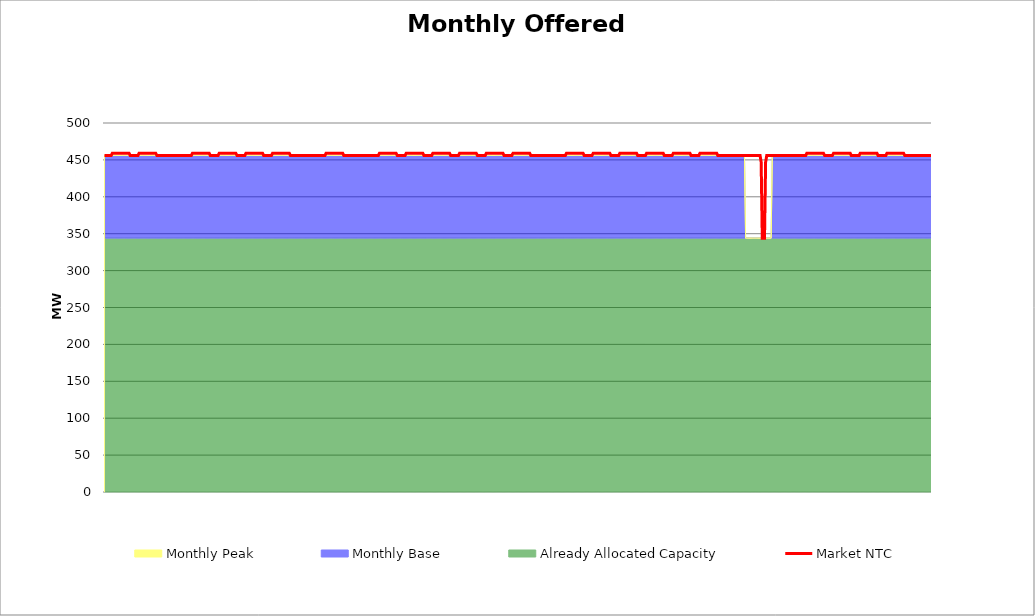
| Category | Market NTC |
|---|---|
| 0 | 456 |
| 1 | 456 |
| 2 | 456 |
| 3 | 456 |
| 4 | 456 |
| 5 | 456 |
| 6 | 456 |
| 7 | 459 |
| 8 | 459 |
| 9 | 459 |
| 10 | 459 |
| 11 | 459 |
| 12 | 459 |
| 13 | 459 |
| 14 | 459 |
| 15 | 459 |
| 16 | 459 |
| 17 | 459 |
| 18 | 459 |
| 19 | 459 |
| 20 | 459 |
| 21 | 459 |
| 22 | 459 |
| 23 | 456 |
| 24 | 456 |
| 25 | 456 |
| 26 | 456 |
| 27 | 456 |
| 28 | 456 |
| 29 | 456 |
| 30 | 456 |
| 31 | 459 |
| 32 | 459 |
| 33 | 459 |
| 34 | 459 |
| 35 | 459 |
| 36 | 459 |
| 37 | 459 |
| 38 | 459 |
| 39 | 459 |
| 40 | 459 |
| 41 | 459 |
| 42 | 459 |
| 43 | 459 |
| 44 | 459 |
| 45 | 459 |
| 46 | 459 |
| 47 | 456 |
| 48 | 456 |
| 49 | 456 |
| 50 | 456 |
| 51 | 456 |
| 52 | 456 |
| 53 | 456 |
| 54 | 456 |
| 55 | 456 |
| 56 | 456 |
| 57 | 456 |
| 58 | 456 |
| 59 | 456 |
| 60 | 456 |
| 61 | 456 |
| 62 | 456 |
| 63 | 456 |
| 64 | 456 |
| 65 | 456 |
| 66 | 456 |
| 67 | 456 |
| 68 | 456 |
| 69 | 456 |
| 70 | 456 |
| 71 | 456 |
| 72 | 456 |
| 73 | 456 |
| 74 | 456 |
| 75 | 456 |
| 76 | 456 |
| 77 | 456 |
| 78 | 456 |
| 79 | 459 |
| 80 | 459 |
| 81 | 459 |
| 82 | 459 |
| 83 | 459 |
| 84 | 459 |
| 85 | 459 |
| 86 | 459 |
| 87 | 459 |
| 88 | 459 |
| 89 | 459 |
| 90 | 459 |
| 91 | 459 |
| 92 | 459 |
| 93 | 459 |
| 94 | 459 |
| 95 | 456 |
| 96 | 456 |
| 97 | 456 |
| 98 | 456 |
| 99 | 456 |
| 100 | 456 |
| 101 | 456 |
| 102 | 456 |
| 103 | 459 |
| 104 | 459 |
| 105 | 459 |
| 106 | 459 |
| 107 | 459 |
| 108 | 459 |
| 109 | 459 |
| 110 | 459 |
| 111 | 459 |
| 112 | 459 |
| 113 | 459 |
| 114 | 459 |
| 115 | 459 |
| 116 | 459 |
| 117 | 459 |
| 118 | 459 |
| 119 | 456 |
| 120 | 456 |
| 121 | 456 |
| 122 | 456 |
| 123 | 456 |
| 124 | 456 |
| 125 | 456 |
| 126 | 456 |
| 127 | 459 |
| 128 | 459 |
| 129 | 459 |
| 130 | 459 |
| 131 | 459 |
| 132 | 459 |
| 133 | 459 |
| 134 | 459 |
| 135 | 459 |
| 136 | 459 |
| 137 | 459 |
| 138 | 459 |
| 139 | 459 |
| 140 | 459 |
| 141 | 459 |
| 142 | 459 |
| 143 | 456 |
| 144 | 456 |
| 145 | 456 |
| 146 | 456 |
| 147 | 456 |
| 148 | 456 |
| 149 | 456 |
| 150 | 456 |
| 151 | 459 |
| 152 | 459 |
| 153 | 459 |
| 154 | 459 |
| 155 | 459 |
| 156 | 459 |
| 157 | 459 |
| 158 | 459 |
| 159 | 459 |
| 160 | 459 |
| 161 | 459 |
| 162 | 459 |
| 163 | 459 |
| 164 | 459 |
| 165 | 459 |
| 166 | 459 |
| 167 | 456 |
| 168 | 456 |
| 169 | 456 |
| 170 | 456 |
| 171 | 456 |
| 172 | 456 |
| 173 | 456 |
| 174 | 456 |
| 175 | 456 |
| 176 | 456 |
| 177 | 456 |
| 178 | 456 |
| 179 | 456 |
| 180 | 456 |
| 181 | 456 |
| 182 | 456 |
| 183 | 456 |
| 184 | 456 |
| 185 | 456 |
| 186 | 456 |
| 187 | 456 |
| 188 | 456 |
| 189 | 456 |
| 190 | 456 |
| 191 | 456 |
| 192 | 456 |
| 193 | 456 |
| 194 | 456 |
| 195 | 456 |
| 196 | 456 |
| 197 | 456 |
| 198 | 456 |
| 199 | 459 |
| 200 | 459 |
| 201 | 459 |
| 202 | 459 |
| 203 | 459 |
| 204 | 459 |
| 205 | 459 |
| 206 | 459 |
| 207 | 459 |
| 208 | 459 |
| 209 | 459 |
| 210 | 459 |
| 211 | 459 |
| 212 | 459 |
| 213 | 459 |
| 214 | 459 |
| 215 | 456 |
| 216 | 456 |
| 217 | 456 |
| 218 | 456 |
| 219 | 456 |
| 220 | 456 |
| 221 | 456 |
| 222 | 456 |
| 223 | 456 |
| 224 | 456 |
| 225 | 456 |
| 226 | 456 |
| 227 | 456 |
| 228 | 456 |
| 229 | 456 |
| 230 | 456 |
| 231 | 456 |
| 232 | 456 |
| 233 | 456 |
| 234 | 456 |
| 235 | 456 |
| 236 | 456 |
| 237 | 456 |
| 238 | 456 |
| 239 | 456 |
| 240 | 456 |
| 241 | 456 |
| 242 | 456 |
| 243 | 456 |
| 244 | 456 |
| 245 | 456 |
| 246 | 456 |
| 247 | 459 |
| 248 | 459 |
| 249 | 459 |
| 250 | 459 |
| 251 | 459 |
| 252 | 459 |
| 253 | 459 |
| 254 | 459 |
| 255 | 459 |
| 256 | 459 |
| 257 | 459 |
| 258 | 459 |
| 259 | 459 |
| 260 | 459 |
| 261 | 459 |
| 262 | 459 |
| 263 | 456 |
| 264 | 456 |
| 265 | 456 |
| 266 | 456 |
| 267 | 456 |
| 268 | 456 |
| 269 | 456 |
| 270 | 456 |
| 271 | 459 |
| 272 | 459 |
| 273 | 459 |
| 274 | 459 |
| 275 | 459 |
| 276 | 459 |
| 277 | 459 |
| 278 | 459 |
| 279 | 459 |
| 280 | 459 |
| 281 | 459 |
| 282 | 459 |
| 283 | 459 |
| 284 | 459 |
| 285 | 459 |
| 286 | 459 |
| 287 | 456 |
| 288 | 456 |
| 289 | 456 |
| 290 | 456 |
| 291 | 456 |
| 292 | 456 |
| 293 | 456 |
| 294 | 456 |
| 295 | 459 |
| 296 | 459 |
| 297 | 459 |
| 298 | 459 |
| 299 | 459 |
| 300 | 459 |
| 301 | 459 |
| 302 | 459 |
| 303 | 459 |
| 304 | 459 |
| 305 | 459 |
| 306 | 459 |
| 307 | 459 |
| 308 | 459 |
| 309 | 459 |
| 310 | 459 |
| 311 | 456 |
| 312 | 456 |
| 313 | 456 |
| 314 | 456 |
| 315 | 456 |
| 316 | 456 |
| 317 | 456 |
| 318 | 456 |
| 319 | 459 |
| 320 | 459 |
| 321 | 459 |
| 322 | 459 |
| 323 | 459 |
| 324 | 459 |
| 325 | 459 |
| 326 | 459 |
| 327 | 459 |
| 328 | 459 |
| 329 | 459 |
| 330 | 459 |
| 331 | 459 |
| 332 | 459 |
| 333 | 459 |
| 334 | 459 |
| 335 | 456 |
| 336 | 456 |
| 337 | 456 |
| 338 | 456 |
| 339 | 456 |
| 340 | 456 |
| 341 | 456 |
| 342 | 456 |
| 343 | 459 |
| 344 | 459 |
| 345 | 459 |
| 346 | 459 |
| 347 | 459 |
| 348 | 459 |
| 349 | 459 |
| 350 | 459 |
| 351 | 459 |
| 352 | 459 |
| 353 | 459 |
| 354 | 459 |
| 355 | 459 |
| 356 | 459 |
| 357 | 459 |
| 358 | 459 |
| 359 | 456 |
| 360 | 456 |
| 361 | 456 |
| 362 | 456 |
| 363 | 456 |
| 364 | 456 |
| 365 | 456 |
| 366 | 456 |
| 367 | 459 |
| 368 | 459 |
| 369 | 459 |
| 370 | 459 |
| 371 | 459 |
| 372 | 459 |
| 373 | 459 |
| 374 | 459 |
| 375 | 459 |
| 376 | 459 |
| 377 | 459 |
| 378 | 459 |
| 379 | 459 |
| 380 | 459 |
| 381 | 459 |
| 382 | 459 |
| 383 | 456 |
| 384 | 456 |
| 385 | 456 |
| 386 | 456 |
| 387 | 456 |
| 388 | 456 |
| 389 | 456 |
| 390 | 456 |
| 391 | 456 |
| 392 | 456 |
| 393 | 456 |
| 394 | 456 |
| 395 | 456 |
| 396 | 456 |
| 397 | 456 |
| 398 | 456 |
| 399 | 456 |
| 400 | 456 |
| 401 | 456 |
| 402 | 456 |
| 403 | 456 |
| 404 | 456 |
| 405 | 456 |
| 406 | 456 |
| 407 | 456 |
| 408 | 456 |
| 409 | 456 |
| 410 | 456 |
| 411 | 456 |
| 412 | 456 |
| 413 | 456 |
| 414 | 456 |
| 415 | 459 |
| 416 | 459 |
| 417 | 459 |
| 418 | 459 |
| 419 | 459 |
| 420 | 459 |
| 421 | 459 |
| 422 | 459 |
| 423 | 459 |
| 424 | 459 |
| 425 | 459 |
| 426 | 459 |
| 427 | 459 |
| 428 | 459 |
| 429 | 459 |
| 430 | 459 |
| 431 | 456 |
| 432 | 456 |
| 433 | 456 |
| 434 | 456 |
| 435 | 456 |
| 436 | 456 |
| 437 | 456 |
| 438 | 456 |
| 439 | 459 |
| 440 | 459 |
| 441 | 459 |
| 442 | 459 |
| 443 | 459 |
| 444 | 459 |
| 445 | 459 |
| 446 | 459 |
| 447 | 459 |
| 448 | 459 |
| 449 | 459 |
| 450 | 459 |
| 451 | 459 |
| 452 | 459 |
| 453 | 459 |
| 454 | 459 |
| 455 | 456 |
| 456 | 456 |
| 457 | 456 |
| 458 | 456 |
| 459 | 456 |
| 460 | 456 |
| 461 | 456 |
| 462 | 456 |
| 463 | 459 |
| 464 | 459 |
| 465 | 459 |
| 466 | 459 |
| 467 | 459 |
| 468 | 459 |
| 469 | 459 |
| 470 | 459 |
| 471 | 459 |
| 472 | 459 |
| 473 | 459 |
| 474 | 459 |
| 475 | 459 |
| 476 | 459 |
| 477 | 459 |
| 478 | 459 |
| 479 | 456 |
| 480 | 456 |
| 481 | 456 |
| 482 | 456 |
| 483 | 456 |
| 484 | 456 |
| 485 | 456 |
| 486 | 456 |
| 487 | 459 |
| 488 | 459 |
| 489 | 459 |
| 490 | 459 |
| 491 | 459 |
| 492 | 459 |
| 493 | 459 |
| 494 | 459 |
| 495 | 459 |
| 496 | 459 |
| 497 | 459 |
| 498 | 459 |
| 499 | 459 |
| 500 | 459 |
| 501 | 459 |
| 502 | 459 |
| 503 | 456 |
| 504 | 456 |
| 505 | 456 |
| 506 | 456 |
| 507 | 456 |
| 508 | 456 |
| 509 | 456 |
| 510 | 456 |
| 511 | 459 |
| 512 | 459 |
| 513 | 459 |
| 514 | 459 |
| 515 | 459 |
| 516 | 459 |
| 517 | 459 |
| 518 | 459 |
| 519 | 459 |
| 520 | 459 |
| 521 | 459 |
| 522 | 459 |
| 523 | 459 |
| 524 | 459 |
| 525 | 459 |
| 526 | 459 |
| 527 | 456 |
| 528 | 456 |
| 529 | 456 |
| 530 | 456 |
| 531 | 456 |
| 532 | 456 |
| 533 | 456 |
| 534 | 456 |
| 535 | 459 |
| 536 | 459 |
| 537 | 459 |
| 538 | 459 |
| 539 | 459 |
| 540 | 459 |
| 541 | 459 |
| 542 | 459 |
| 543 | 459 |
| 544 | 459 |
| 545 | 459 |
| 546 | 459 |
| 547 | 459 |
| 548 | 459 |
| 549 | 459 |
| 550 | 459 |
| 551 | 456 |
| 552 | 456 |
| 553 | 456 |
| 554 | 456 |
| 555 | 456 |
| 556 | 456 |
| 557 | 456 |
| 558 | 456 |
| 559 | 456 |
| 560 | 456 |
| 561 | 456 |
| 562 | 456 |
| 563 | 456 |
| 564 | 456 |
| 565 | 456 |
| 566 | 456 |
| 567 | 456 |
| 568 | 456 |
| 569 | 456 |
| 570 | 456 |
| 571 | 456 |
| 572 | 456 |
| 573 | 456 |
| 574 | 456 |
| 575 | 456 |
| 576 | 456 |
| 577 | 456 |
| 578 | 456 |
| 579 | 456 |
| 580 | 456 |
| 581 | 456 |
| 582 | 456 |
| 583 | 456 |
| 584 | 456 |
| 585 | 456 |
| 586 | 456 |
| 587 | 456 |
| 588 | 456 |
| 589 | 456 |
| 590 | 447 |
| 591 | 344 |
| 592 | 344 |
| 593 | 344 |
| 594 | 447 |
| 595 | 456 |
| 596 | 456 |
| 597 | 456 |
| 598 | 456 |
| 599 | 456 |
| 600 | 456 |
| 601 | 456 |
| 602 | 456 |
| 603 | 456 |
| 604 | 456 |
| 605 | 456 |
| 606 | 456 |
| 607 | 456 |
| 608 | 456 |
| 609 | 456 |
| 610 | 456 |
| 611 | 456 |
| 612 | 456 |
| 613 | 456 |
| 614 | 456 |
| 615 | 456 |
| 616 | 456 |
| 617 | 456 |
| 618 | 456 |
| 619 | 456 |
| 620 | 456 |
| 621 | 456 |
| 622 | 456 |
| 623 | 456 |
| 624 | 456 |
| 625 | 456 |
| 626 | 456 |
| 627 | 456 |
| 628 | 456 |
| 629 | 456 |
| 630 | 456 |
| 631 | 459 |
| 632 | 459 |
| 633 | 459 |
| 634 | 459 |
| 635 | 459 |
| 636 | 459 |
| 637 | 459 |
| 638 | 459 |
| 639 | 459 |
| 640 | 459 |
| 641 | 459 |
| 642 | 459 |
| 643 | 459 |
| 644 | 459 |
| 645 | 459 |
| 646 | 459 |
| 647 | 456 |
| 648 | 456 |
| 649 | 456 |
| 650 | 456 |
| 651 | 456 |
| 652 | 456 |
| 653 | 456 |
| 654 | 456 |
| 655 | 459 |
| 656 | 459 |
| 657 | 459 |
| 658 | 459 |
| 659 | 459 |
| 660 | 459 |
| 661 | 459 |
| 662 | 459 |
| 663 | 459 |
| 664 | 459 |
| 665 | 459 |
| 666 | 459 |
| 667 | 459 |
| 668 | 459 |
| 669 | 459 |
| 670 | 459 |
| 671 | 456 |
| 672 | 456 |
| 673 | 456 |
| 674 | 456 |
| 675 | 456 |
| 676 | 456 |
| 677 | 456 |
| 678 | 456 |
| 679 | 459 |
| 680 | 459 |
| 681 | 459 |
| 682 | 459 |
| 683 | 459 |
| 684 | 459 |
| 685 | 459 |
| 686 | 459 |
| 687 | 459 |
| 688 | 459 |
| 689 | 459 |
| 690 | 459 |
| 691 | 459 |
| 692 | 459 |
| 693 | 459 |
| 694 | 459 |
| 695 | 456 |
| 696 | 456 |
| 697 | 456 |
| 698 | 456 |
| 699 | 456 |
| 700 | 456 |
| 701 | 456 |
| 702 | 456 |
| 703 | 459 |
| 704 | 459 |
| 705 | 459 |
| 706 | 459 |
| 707 | 459 |
| 708 | 459 |
| 709 | 459 |
| 710 | 459 |
| 711 | 459 |
| 712 | 459 |
| 713 | 459 |
| 714 | 459 |
| 715 | 459 |
| 716 | 459 |
| 717 | 459 |
| 718 | 459 |
| 719 | 456 |
| 720 | 456 |
| 721 | 456 |
| 722 | 456 |
| 723 | 456 |
| 724 | 456 |
| 725 | 456 |
| 726 | 456 |
| 727 | 456 |
| 728 | 456 |
| 729 | 456 |
| 730 | 456 |
| 731 | 456 |
| 732 | 456 |
| 733 | 456 |
| 734 | 456 |
| 735 | 456 |
| 736 | 456 |
| 737 | 456 |
| 738 | 456 |
| 739 | 456 |
| 740 | 456 |
| 741 | 456 |
| 742 | 456 |
| 743 | 456 |